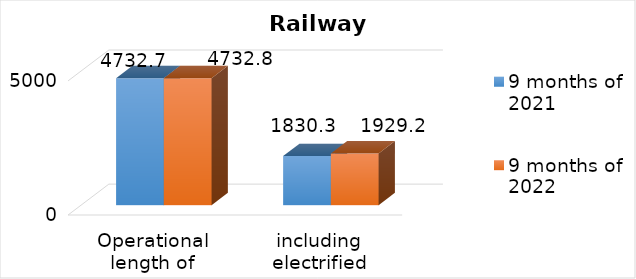
| Category | 9 months of 2021 | 9 months of 2022 |
|---|---|---|
| Operational length of railways, km | 4732.7 | 4732.8 |
| including electrified roads, km | 1830.3 | 1929.21 |